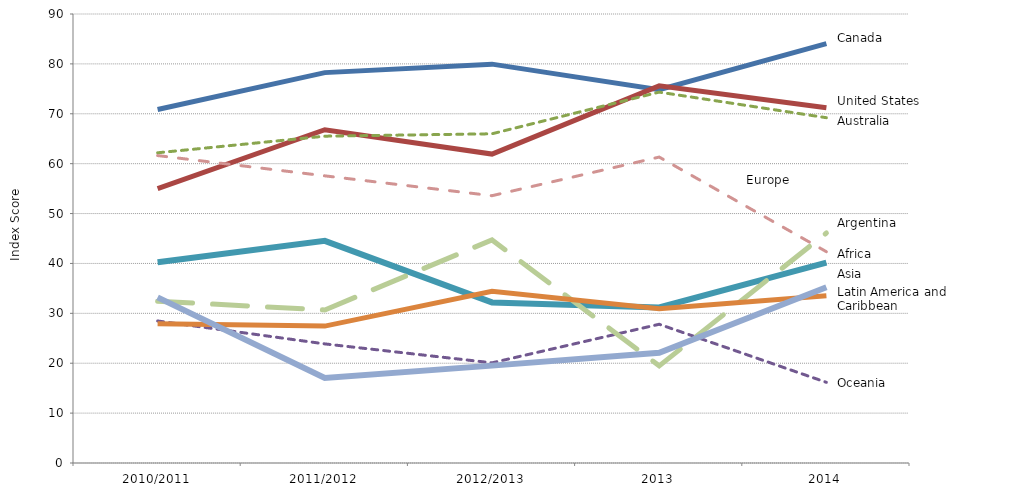
| Category | Canada | United States | Australia | Oceania | Africa | Argentina | Latin American and Caribbean | Asia | Europe |
|---|---|---|---|---|---|---|---|---|---|
| 2010/2011 | 70.85 | 54.99 | 62.18 | 28.47 | 40.23 | 32.44 | 27.89 | 33.205 | 61.625 |
| 2011/2012 | 78.25 | 66.81 | 65.51 | 23.875 | 44.53 | 30.675 | 27.445 | 17.03 | 57.56 |
| 2012/2013 | 79.95 | 61.92 | 65.99 | 20.08 | 32.19 | 44.715 | 34.41 | 19.52 | 53.58 |
| 2013 | 74.82 | 75.6 | 74.34 | 27.81 | 31.17 | 19.47 | 30.9 | 22.08 | 61.32 |
| 2014 | 84.055 | 71.19 | 69.21 | 16.17 | 40.18 | 46.1 | 33.53 | 35.23 | 42.355 |